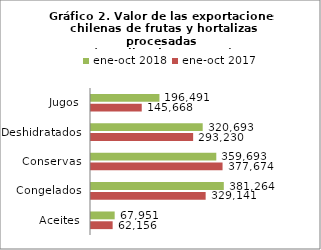
| Category | ene-oct 2017 | ene-oct 2018 |
|---|---|---|
| Aceites | 62155810.85 | 67951048.06 |
| Congelados | 329141029.03 | 381264304.56 |
| Conservas | 377674295.17 | 359693016.77 |
| Deshidratados | 293229740.87 | 320693384.65 |
| Jugos | 145668100.23 | 196491344.47 |